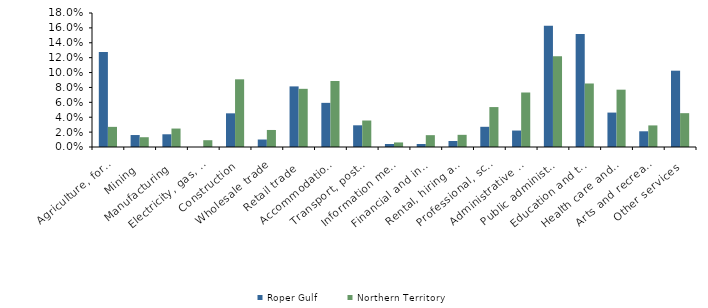
| Category | Roper Gulf | Northern Territory |
|---|---|---|
| Agriculture, forestry and fishing | 0.128 | 0.027 |
| Mining | 0.016 | 0.013 |
| Manufacturing | 0.017 | 0.025 |
| Electricity, gas, water and waste services | 0 | 0.009 |
| Construction | 0.045 | 0.091 |
| Wholesale trade | 0.01 | 0.023 |
| Retail trade | 0.081 | 0.078 |
| Accommodation and food services | 0.059 | 0.089 |
| Transport, postal and warehousing | 0.029 | 0.036 |
| Information media and telecommunications | 0.004 | 0.006 |
| Financial and insurance services | 0.004 | 0.016 |
| Rental, hiring and real estate services | 0.008 | 0.016 |
| Professional, scientific and technical services | 0.027 | 0.054 |
| Administrative and support services | 0.022 | 0.073 |
| Public administration and safety | 0.163 | 0.122 |
| Education and training | 0.152 | 0.085 |
| Health care and social assistance | 0.046 | 0.077 |
| Arts and recreation services | 0.021 | 0.029 |
| Other services | 0.103 | 0.045 |